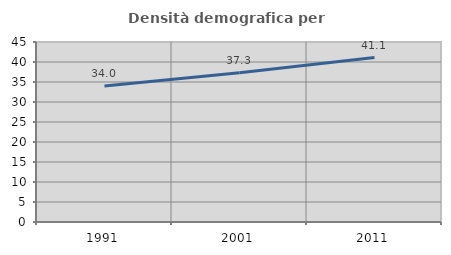
| Category | Densità demografica |
|---|---|
| 1991.0 | 33.988 |
| 2001.0 | 37.285 |
| 2011.0 | 41.103 |